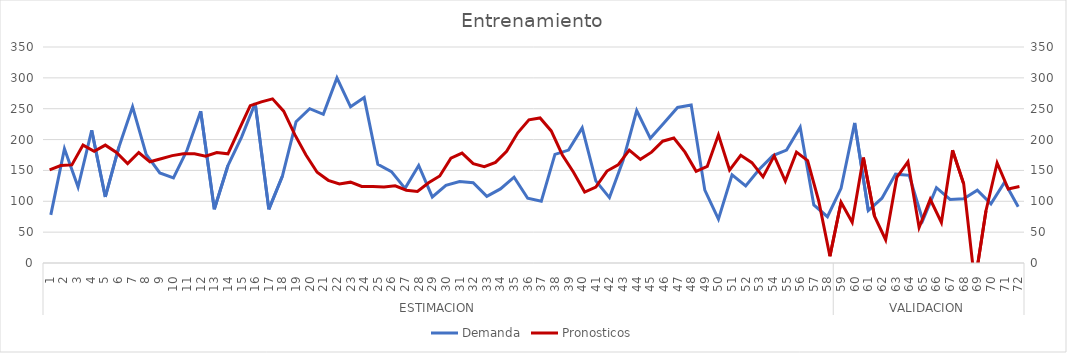
| Category | Demanda |
|---|---|
| 0 | 78 |
| 1 | 185 |
| 2 | 123 |
| 3 | 215 |
| 4 | 107 |
| 5 | 188 |
| 6 | 253 |
| 7 | 176 |
| 8 | 146 |
| 9 | 138 |
| 10 | 183 |
| 11 | 246 |
| 12 | 87 |
| 13 | 158 |
| 14 | 204 |
| 15 | 259 |
| 16 | 87 |
| 17 | 141 |
| 18 | 229 |
| 19 | 250 |
| 20 | 241 |
| 21 | 300 |
| 22 | 253 |
| 23 | 268 |
| 24 | 160 |
| 25 | 148 |
| 26 | 121 |
| 27 | 158 |
| 28 | 107 |
| 29 | 126 |
| 30 | 132 |
| 31 | 130 |
| 32 | 108 |
| 33 | 120 |
| 34 | 139 |
| 35 | 105 |
| 36 | 100 |
| 37 | 176 |
| 38 | 183 |
| 39 | 219 |
| 40 | 133 |
| 41 | 106 |
| 42 | 166 |
| 43 | 247 |
| 44 | 202 |
| 45 | 227 |
| 46 | 252 |
| 47 | 256 |
| 48 | 118 |
| 49 | 71 |
| 50 | 143 |
| 51 | 125 |
| 52 | 152 |
| 53 | 174 |
| 54 | 183 |
| 55 | 220 |
| 56 | 94 |
| 57 | 75 |
| 58 | 121 |
| 59 | 227 |
| 60 | 85 |
| 61 | 105 |
| 62 | 144 |
| 63 | 142 |
| 64 | 69 |
| 65 | 122 |
| 66 | 103 |
| 67 | 104 |
| 68 | 118 |
| 69 | 96 |
| 70 | 131 |
| 71 | 91 |